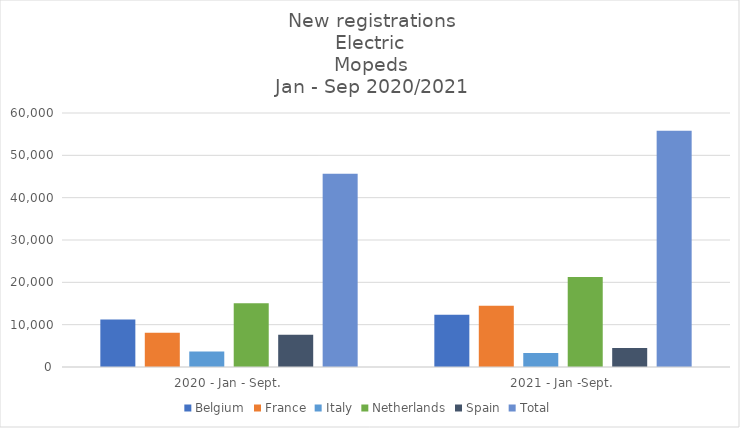
| Category | Belgium | France | Italy | Netherlands | Spain | Total |
|---|---|---|---|---|---|---|
| 2020 - Jan - Sept. | 11247 | 8111 | 3680 | 15034 | 7605 | 45677 |
| 2021 - Jan -Sept. | 12357 | 14449 | 3320 | 21235 | 4475 | 55836 |